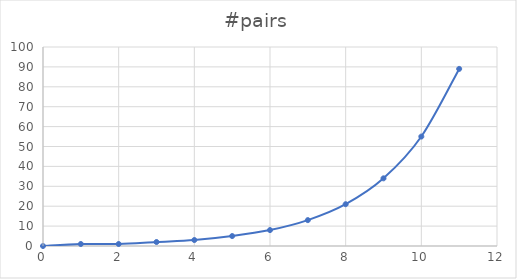
| Category | #pairs |
|---|---|
| 0.0 | 0 |
| 1.0 | 1 |
| 2.0 | 1 |
| 3.0 | 2 |
| 4.0 | 3 |
| 5.0 | 5 |
| 6.0 | 8 |
| 7.0 | 13 |
| 8.0 | 21 |
| 9.0 | 34 |
| 10.0 | 55 |
| 11.0 | 89 |